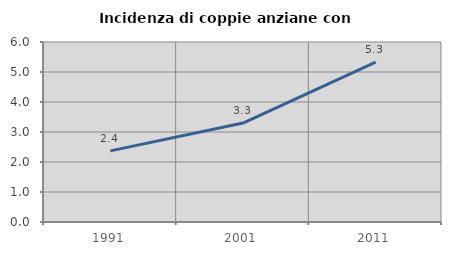
| Category | Incidenza di coppie anziane con figli |
|---|---|
| 1991.0 | 2.37 |
| 2001.0 | 3.299 |
| 2011.0 | 5.332 |